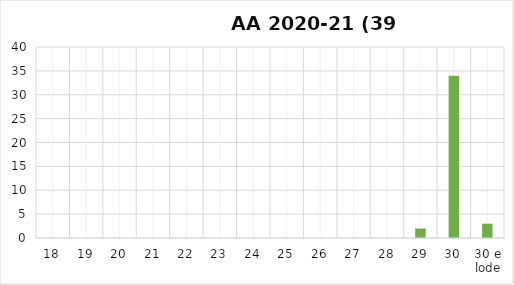
| Category | Series 0 |
|---|---|
| 18 | 0 |
| 19 | 0 |
| 20 | 0 |
| 21 | 0 |
| 22 | 0 |
| 23 | 0 |
| 24 | 0 |
| 25 | 0 |
| 26 | 0 |
| 27 | 0 |
| 28 | 0 |
| 29 | 2 |
| 30 | 34 |
| 30 e lode | 3 |